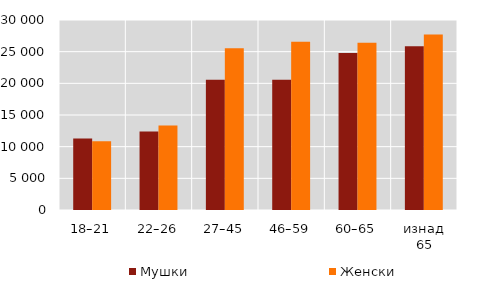
| Category | Мушки | Женски |
|---|---|---|
| 18–21 | 11306 | 10838 |
| 22–26 | 12398 | 13357 |
| 27–45 | 20573 | 25558 |
| 46–59 | 20552 | 26562 |
| 60–65 | 24801 | 26401 |
| изнад 65 | 25859 | 27724 |